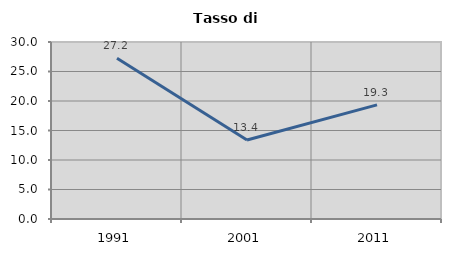
| Category | Tasso di disoccupazione   |
|---|---|
| 1991.0 | 27.245 |
| 2001.0 | 13.395 |
| 2011.0 | 19.349 |